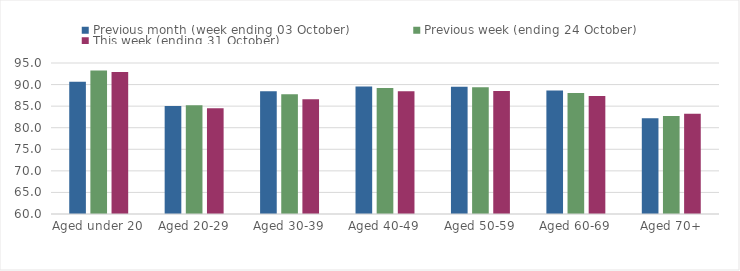
| Category | Previous month (week ending 03 October) | Previous week (ending 24 October) | This week (ending 31 October) |
|---|---|---|---|
| Aged under 20 | 90.68 | 93.25 | 92.93 |
| Aged 20-29 | 85.06 | 85.23 | 84.52 |
| Aged 30-39 | 88.46 | 87.73 | 86.6 |
| Aged 40-49 | 89.53 | 89.21 | 88.48 |
| Aged 50-59 | 89.48 | 89.38 | 88.52 |
| Aged 60-69 | 88.65 | 88.02 | 87.36 |
| Aged 70+ | 82.2 | 82.7 | 83.21 |